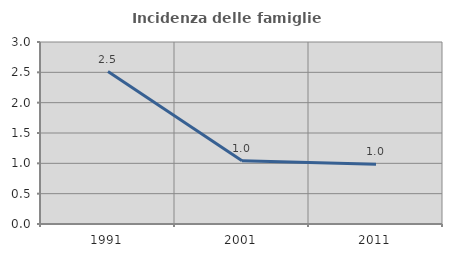
| Category | Incidenza delle famiglie numerose |
|---|---|
| 1991.0 | 2.513 |
| 2001.0 | 1.041 |
| 2011.0 | 0.984 |